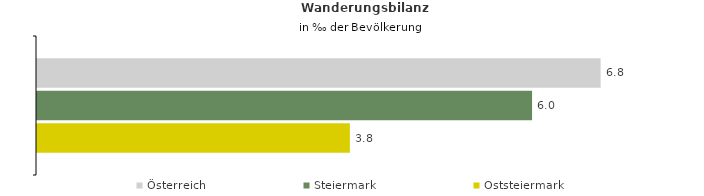
| Category | Österreich | Steiermark | Oststeiermark |
|---|---|---|---|
| Wanderungsrate in ‰ der Bevölkerung, Periode 2018-2022 | 6.822 | 5.992 | 3.787 |